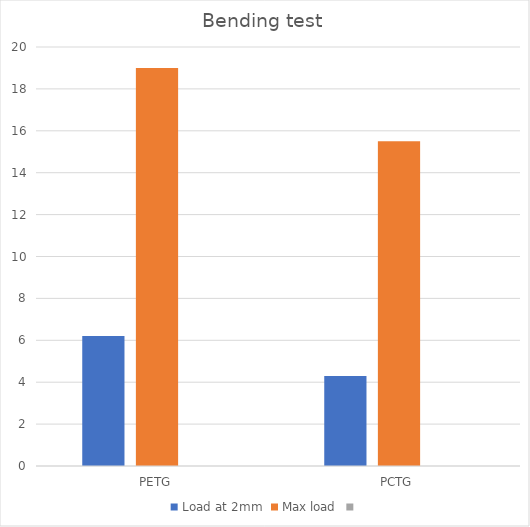
| Category | Load at 2mm | Max load | Series 2 |
|---|---|---|---|
| PETG | 6.2 | 19 |  |
| PCTG | 4.3 | 15.5 |  |